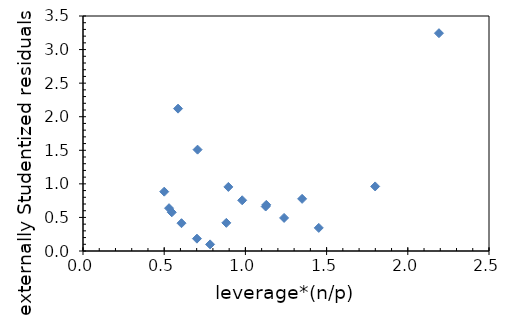
| Category | Series 0 |
|---|---|
| 1.349255323697074 | 0.777 |
| 1.2382505798220904 | 0.493 |
| 1.1249542772479848 | 0.662 |
| 0.9802314666821915 | 0.755 |
| 0.8950611241911336 | 0.954 |
| 0.7826943496188548 | 0.098 |
| 0.7015367016490733 | 0.184 |
| 0.6065177998185055 | 0.414 |
| 0.5467161162599298 | 0.576 |
| 0.5298671981636479 | 0.638 |
| 0.500254268897543 | 0.884 |
| 0.5852949046791387 | 2.12 |
| 0.7055263819114455 | 1.509 |
| 0.8825687088383599 | 0.42 |
| 1.128609878669432 | 0.687 |
| 1.4518525315837556 | 0.344 |
| 1.799016343012474 | 0.962 |
| 2.191792045257385 | 3.244 |